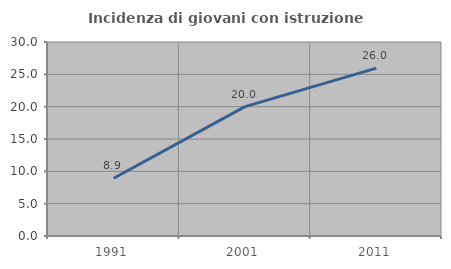
| Category | Incidenza di giovani con istruzione universitaria |
|---|---|
| 1991.0 | 8.931 |
| 2001.0 | 20 |
| 2011.0 | 25.955 |